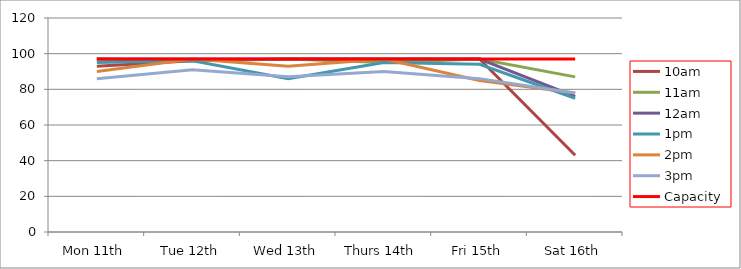
| Category | 9am | 10am | 11am | 12am | 1pm | 2pm | 3pm | 4pm | 5pm | Capacity |
|---|---|---|---|---|---|---|---|---|---|---|
| Mon 11th |  | 93 | 97 | 97 | 95 | 90 | 86 |  |  | 97 |
| Tue 12th |  | 96 | 96 | 97 | 96 | 97 | 91 |  |  | 97 |
| Wed 13th |  | 97 | 97 | 97 | 86 | 93 | 87 |  |  | 97 |
| Thurs 14th |  | 97 | 95 | 97 | 95 | 97 | 90 |  |  | 97 |
| Fri 15th |  | 97 | 97 | 97 | 94 | 85 | 86 |  |  | 97 |
| Sat 16th |  | 43 | 87 | 76 | 75 | 78 | 78 |  |  | 97 |